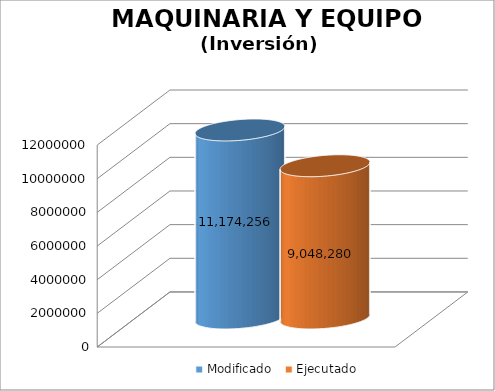
| Category | Modificado | Ejecutado |
|---|---|---|
| 0 | 11174256 | 9048279.97 |